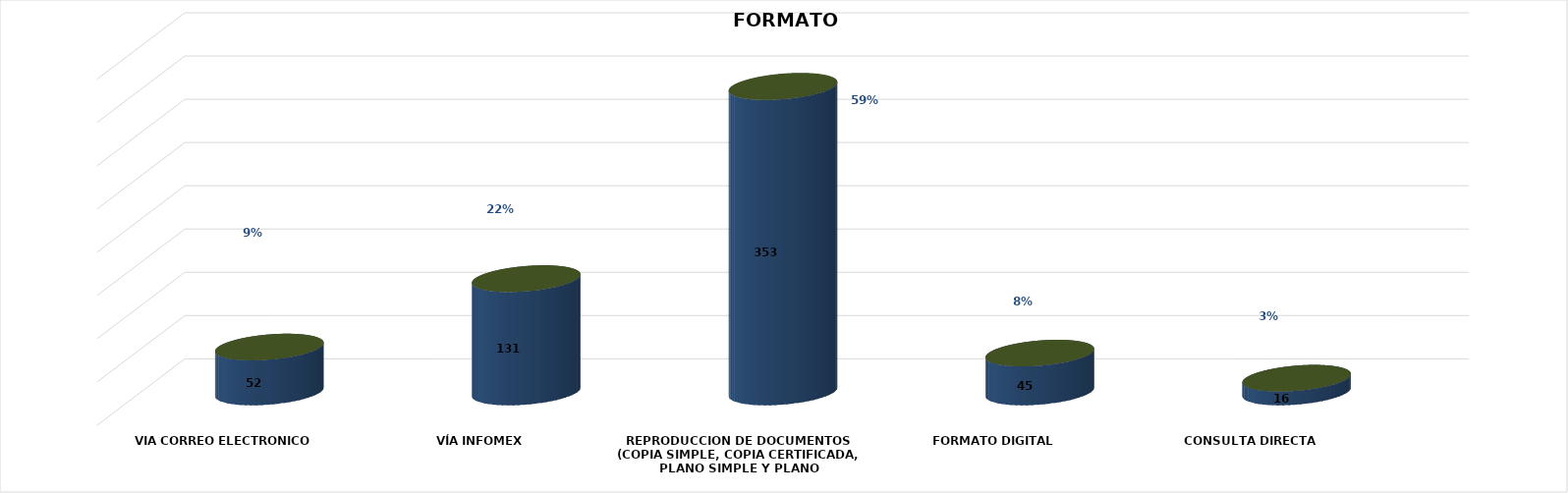
| Category | Series 0 | Series 1 | Series 2 | Series 3 | Series 4 |
|---|---|---|---|---|---|
| VIA CORREO ELECTRONICO |  |  |  | 52 | 0.087 |
| VÍA INFOMEX |  |  |  | 131 | 0.219 |
| REPRODUCCION DE DOCUMENTOS (COPIA SIMPLE, COPIA CERTIFICADA, PLANO SIMPLE Y PLANO CERTIFICADO) |  |  |  | 353 | 0.591 |
| FORMATO DIGITAL |  |  |  | 45 | 0.075 |
| CONSULTA DIRECTA |  |  |  | 16 | 0.027 |